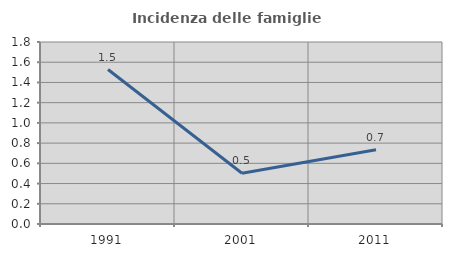
| Category | Incidenza delle famiglie numerose |
|---|---|
| 1991.0 | 1.528 |
| 2001.0 | 0.502 |
| 2011.0 | 0.733 |